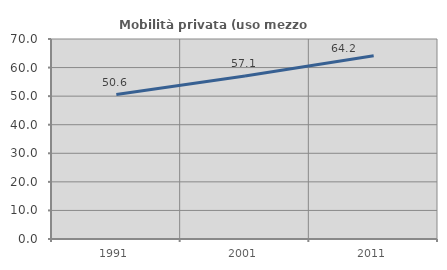
| Category | Mobilità privata (uso mezzo privato) |
|---|---|
| 1991.0 | 50.567 |
| 2001.0 | 57.086 |
| 2011.0 | 64.167 |